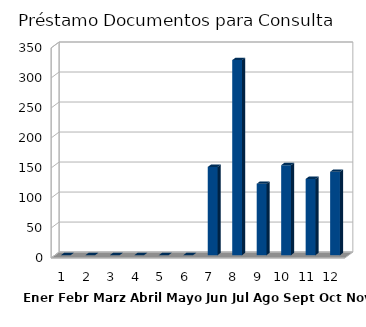
| Category | Series 0 |
|---|---|
| 0 | 0 |
| 1 | 0 |
| 2 | 0 |
| 3 | 0 |
| 4 | 0 |
| 5 | 0 |
| 6 | 147 |
| 7 | 325 |
| 8 | 119 |
| 9 | 150 |
| 10 | 127 |
| 11 | 139 |